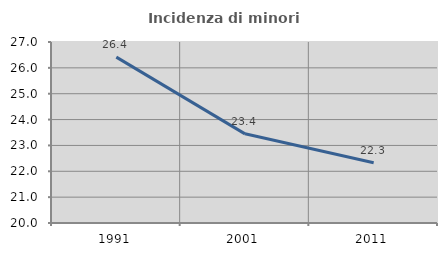
| Category | Incidenza di minori stranieri |
|---|---|
| 1991.0 | 26.415 |
| 2001.0 | 23.448 |
| 2011.0 | 22.33 |